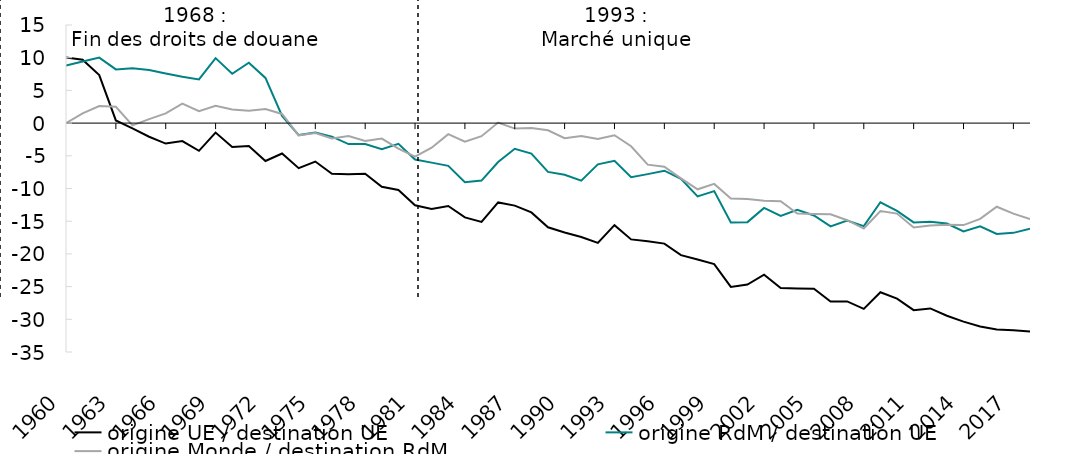
| Category | origine UE / destination UE | origine RdM / destination UE | origine Monde / destination RdM |
|---|---|---|---|
| 1960.0 | 10.047 | 8.82 | 0 |
| 1961.0 | 9.678 | 9.413 | 1.491 |
| 1962.0 | 7.344 | 10.008 | 2.602 |
| 1963.0 | 0.403 | 8.212 | 2.495 |
| 1964.0 | -0.804 | 8.377 | -0.357 |
| 1965.0 | -2.083 | 8.129 | 0.6 |
| 1966.0 | -3.13 | 7.595 | 1.477 |
| 1967.0 | -2.749 | 7.072 | 2.968 |
| 1968.0 | -4.237 | 6.681 | 1.825 |
| 1969.0 | -1.45 | 9.934 | 2.646 |
| 1970.0 | -3.637 | 7.55 | 2.078 |
| 1971.0 | -3.52 | 9.223 | 1.878 |
| 1972.0 | -5.794 | 6.91 | 2.15 |
| 1973.0 | -4.647 | 1.096 | 1.394 |
| 1974.0 | -6.888 | -1.831 | -1.872 |
| 1975.0 | -5.875 | -1.453 | -1.528 |
| 1976.0 | -7.751 | -2.068 | -2.343 |
| 1977.0 | -7.836 | -3.204 | -1.977 |
| 1978.0 | -7.742 | -3.206 | -2.72 |
| 1979.0 | -9.728 | -3.991 | -2.363 |
| 1980.0 | -10.235 | -3.173 | -3.893 |
| 1981.0 | -12.561 | -5.562 | -5.137 |
| 1982.0 | -13.115 | -6.046 | -3.767 |
| 1983.0 | -12.678 | -6.536 | -1.685 |
| 1984.0 | -14.419 | -9.041 | -2.847 |
| 1985.0 | -15.104 | -8.791 | -1.998 |
| 1986.0 | -12.128 | -5.949 | 0.08 |
| 1987.0 | -12.621 | -3.921 | -0.838 |
| 1988.0 | -13.661 | -4.665 | -0.743 |
| 1989.0 | -15.928 | -7.464 | -1.098 |
| 1990.0 | -16.724 | -7.887 | -2.301 |
| 1991.0 | -17.407 | -8.793 | -1.983 |
| 1992.0 | -18.31 | -6.305 | -2.437 |
| 1993.0 | -15.604 | -5.766 | -1.86 |
| 1994.0 | -17.783 | -8.286 | -3.535 |
| 1995.0 | -18.074 | -7.801 | -6.354 |
| 1996.0 | -18.423 | -7.281 | -6.681 |
| 1997.0 | -20.184 | -8.509 | -8.462 |
| 1998.0 | -20.867 | -11.207 | -10.121 |
| 1999.0 | -21.561 | -10.396 | -9.296 |
| 2000.0 | -25.049 | -15.187 | -11.527 |
| 2001.0 | -24.678 | -15.143 | -11.588 |
| 2002.0 | -23.171 | -12.974 | -11.866 |
| 2003.0 | -25.213 | -14.207 | -11.951 |
| 2004.0 | -25.272 | -13.257 | -13.841 |
| 2005.0 | -25.326 | -14.132 | -13.893 |
| 2006.0 | -27.293 | -15.796 | -13.944 |
| 2007.0 | -27.265 | -14.91 | -14.849 |
| 2008.0 | -28.408 | -15.752 | -16.124 |
| 2009.0 | -25.861 | -12.111 | -13.433 |
| 2010.0 | -26.844 | -13.415 | -13.839 |
| 2011.0 | -28.597 | -15.19 | -15.974 |
| 2012.0 | -28.337 | -15.089 | -15.672 |
| 2013.0 | -29.46 | -15.354 | -15.531 |
| 2014.0 | -30.356 | -16.571 | -15.596 |
| 2015.0 | -31.092 | -15.782 | -14.644 |
| 2016.0 | -31.57 | -16.955 | -12.784 |
| 2017.0 | -31.668 | -16.781 | -13.846 |
| 2018.0 | -31.87 | -16.168 | -14.665 |